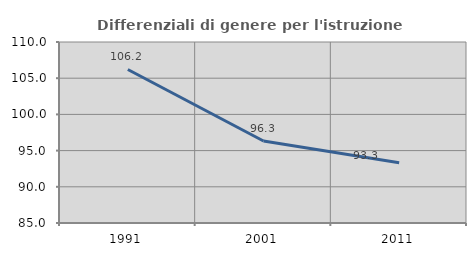
| Category | Differenziali di genere per l'istruzione superiore |
|---|---|
| 1991.0 | 106.208 |
| 2001.0 | 96.327 |
| 2011.0 | 93.327 |